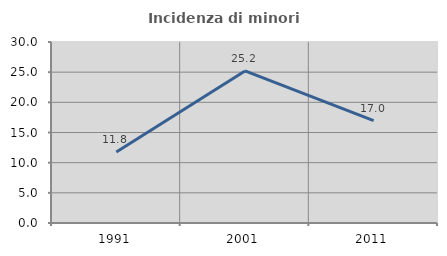
| Category | Incidenza di minori stranieri |
|---|---|
| 1991.0 | 11.765 |
| 2001.0 | 25.203 |
| 2011.0 | 16.981 |